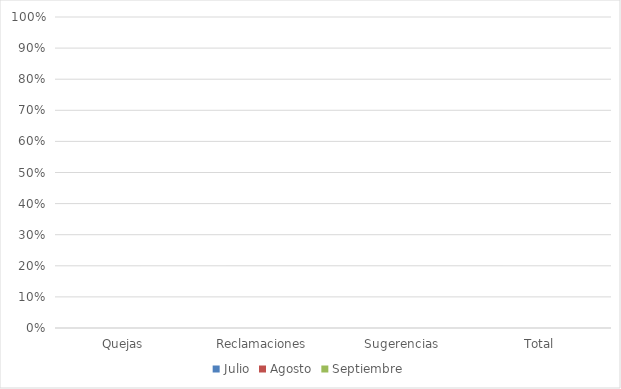
| Category | Julio | Agosto | Septiembre |
|---|---|---|---|
| Quejas | 0 | 0 | 0 |
| Reclamaciones | 0 | 0 | 0 |
| Sugerencias | 0 | 0 | 0 |
| Total | 0 | 0 | 0 |